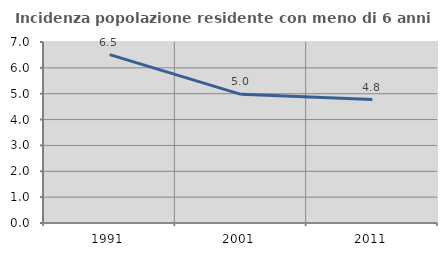
| Category | Incidenza popolazione residente con meno di 6 anni |
|---|---|
| 1991.0 | 6.513 |
| 2001.0 | 4.977 |
| 2011.0 | 4.775 |